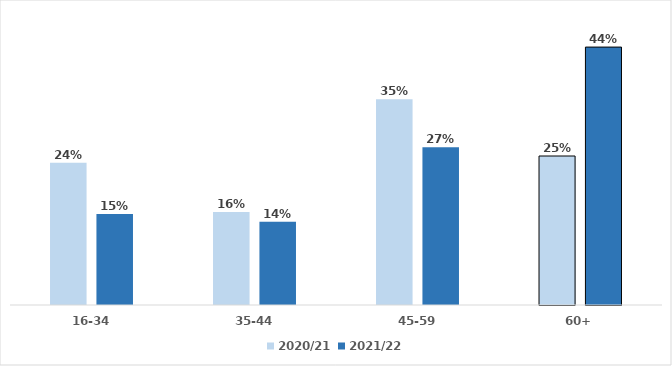
| Category | 2020/21 | 2021/22 |
|---|---|---|
| 16-34 | 0.241 | 0.154 |
| 35-44 | 0.157 | 0.141 |
| 45-59 | 0.349 | 0.267 |
| 60+ | 0.253 | 0.437 |